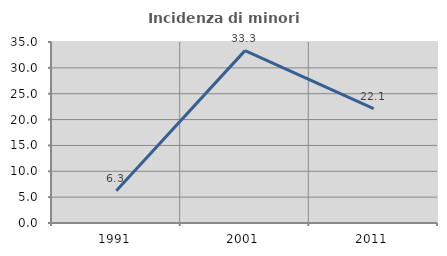
| Category | Incidenza di minori stranieri |
|---|---|
| 1991.0 | 6.25 |
| 2001.0 | 33.333 |
| 2011.0 | 22.105 |